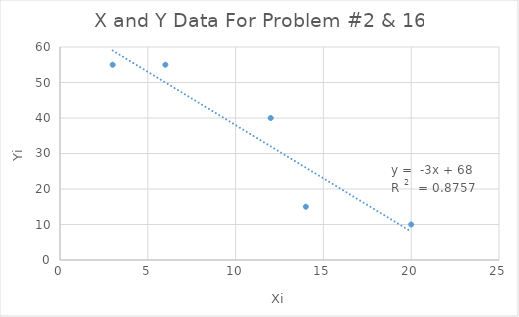
| Category | Yi |
|---|---|
| 3.0 | 55 |
| 12.0 | 40 |
| 6.0 | 55 |
| 20.0 | 10 |
| 14.0 | 15 |